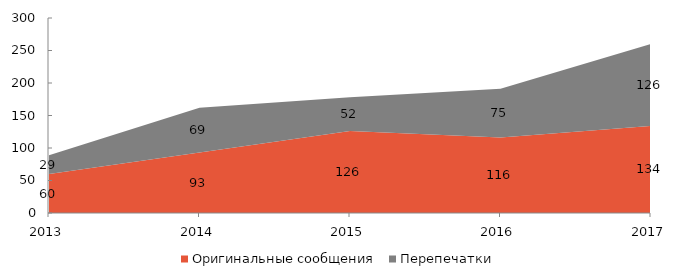
| Category | Оригинальные сообщения | Перепечатки |
|---|---|---|
| 2013 | 60 | 29 |
| 2014 | 93 | 69 |
| 2015 | 126 | 52 |
| 2016 | 116 | 75 |
| 2017 | 134 | 126 |